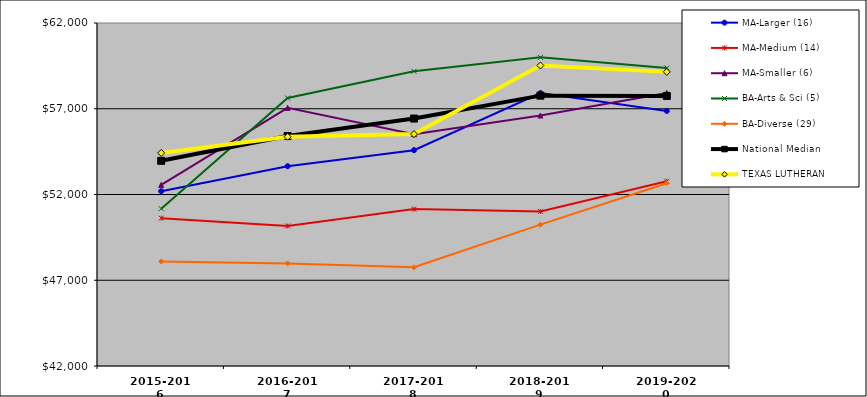
| Category | MA-Larger (16) | MA-Medium (14) | MA-Smaller (6) | BA-Arts & Sci (5) | BA-Diverse (29) | National Median | TEXAS LUTHERAN |
|---|---|---|---|---|---|---|---|
| 2015-2016 | 52195.5 | 50620.5 | 52560 | 51174 | 48096 | 53964 | 54423 |
| 2016-2017 | 53649 | 50165 | 57050.5 | 57625 | 47983 | 55410 | 55368 |
| 2017-2018 | 54585.5 | 51148 | 55517 | 59184 | 47755 | 56428 | 55522 |
| 2018-2019 | 57914.5 | 51013 | 56605 | 59998 | 50242 | 57764 | 59522 |
| 2019-2020 | 56872.5 | 52772 | 57921.5 | 59377 | 52660 | 57747 | 59150 |